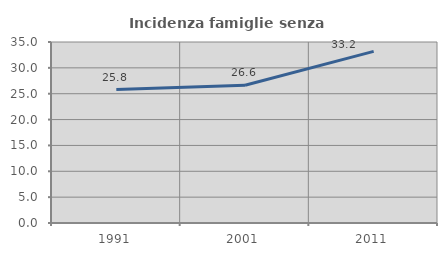
| Category | Incidenza famiglie senza nuclei |
|---|---|
| 1991.0 | 25.799 |
| 2001.0 | 26.637 |
| 2011.0 | 33.189 |